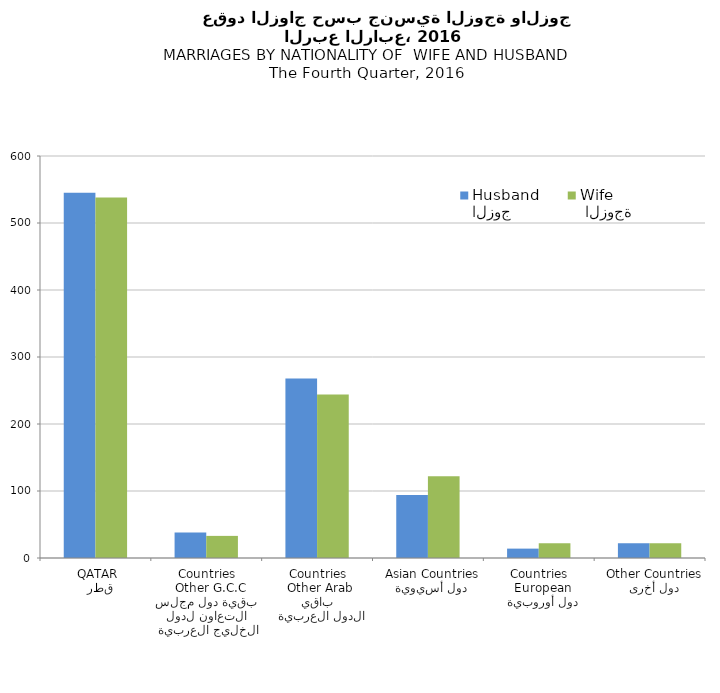
| Category | الزوج
Husband |  الزوجة
Wife |
|---|---|---|
|   قطر
 QATAR | 545 | 538 |
|  بقية دول مجلس التعاون لدول الخليج العربية
  Other G.C.C Countries | 38 | 33 |
|   باقي الدول العربية
 Other Arab Countries | 268 | 244 |
|   دول أسيوية
  Asian Countries | 94 | 122 |
|   دول أوروبية
  European Countries | 14 | 22 |
|   دول أخرى
  Other Countries | 22 | 22 |